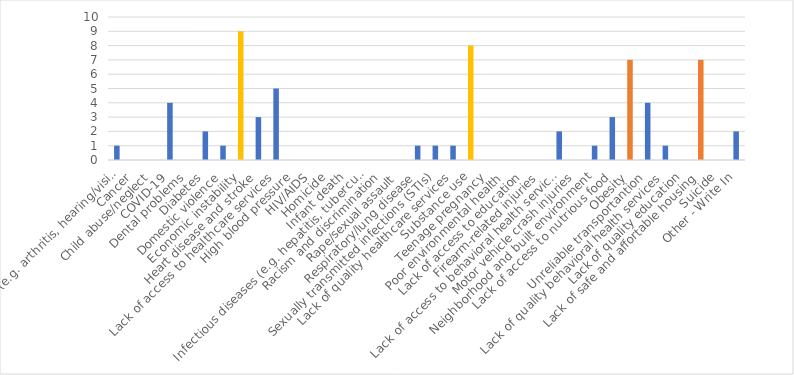
| Category | Number of Responses |
|---|---|
| Aging problems (e.g. arthritis, hearing/vision loss, etc.) | 1 |
| Cancer | 0 |
| Child abuse/neglect | 0 |
| COVID-19 | 4 |
| Dental problems | 0 |
| Diabetes | 2 |
| Domestic violence | 1 |
| Economic instability | 9 |
| Heart disease and stroke | 3 |
| Lack of access to healthcare services | 5 |
| High blood pressure | 0 |
| HIV/AIDS | 0 |
| Homicide | 0 |
| Infant death | 0 |
| Infectious diseases (e.g. hepatitis, tuberculosis, etc.) | 0 |
| Racism and discrimination | 0 |
| Rape/sexual assault | 0 |
| Respiratory/lung disease | 1 |
| Sexually transmitted infections (STIs) | 1 |
| Lack of quality healthcare services | 1 |
| Substance use | 8 |
| Teenage pregnancy | 0 |
| Poor environmental health | 0 |
| Lack of access to education | 0 |
| Firearm-related injuries | 0 |
| Lack of access to behavioral health services | 2 |
| Motor vehicle crash injuries | 0 |
| Neighborhood and built environment | 1 |
| Lack of access to nutrious food | 3 |
| Obesity | 7 |
| Unreliable transportantion | 4 |
| Lack of quality behavioral health services | 1 |
| Lack of quality education | 0 |
| Lack of safe and affortable housing | 7 |
| Suicide | 0 |
| Other - Write In | 2 |